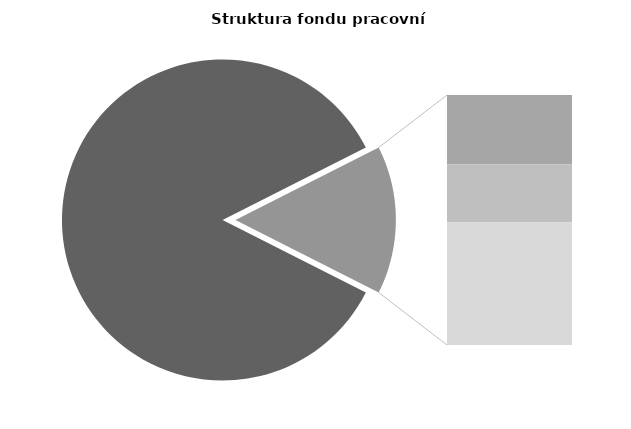
| Category | Series 0 |
|---|---|
| Průměrná měsíční 
odpracovaná doba  
bez přesčasu | 146.19 |
| Dovolená | 7.111 |
| Nemoc | 5.919 |
| Jiné | 12.594 |